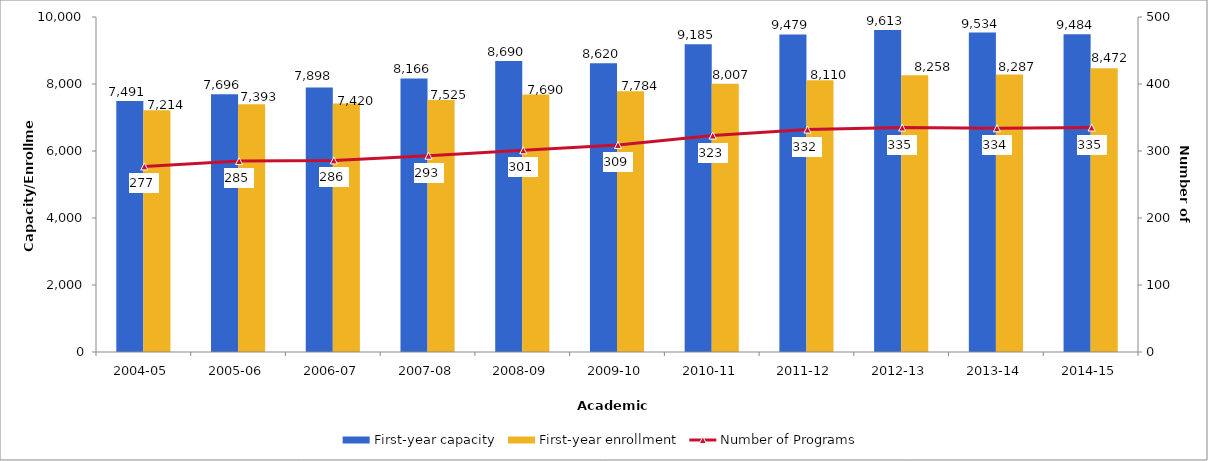
| Category | First-year capacity | First-year enrollment |
|---|---|---|
| 2004-05 | 7491 | 7214 |
| 2005-06 | 7696 | 7393 |
| 2006-07 | 7898 | 7420 |
| 2007-08 | 8166 | 7525 |
| 2008-09 | 8690 | 7690 |
| 2009-10 | 8620 | 7784 |
| 2010-11 | 9185 | 8007 |
| 2011-12 | 9479 | 8110 |
| 2012-13 | 9613 | 8258 |
| 2013-14 | 9534 | 8287 |
| 2014-15 | 9484 | 8472 |